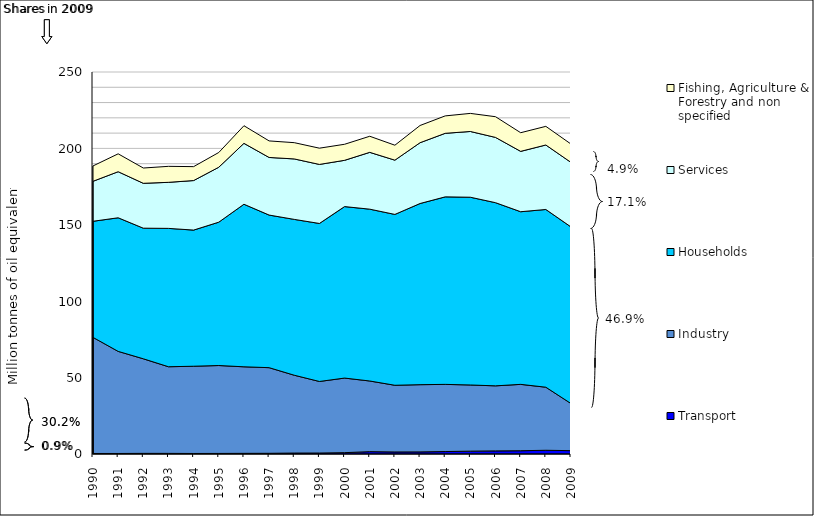
| Category | Transport | Industry | Households | Services | Fishing, Agriculture & Forestry and non specified |
|---|---|---|---|---|---|
| 1990.0 | 0.338 | 75.982 | 75.989 | 26.167 | 10.04 |
| 1991.0 | 0.339 | 66.817 | 87.44 | 30.148 | 11.707 |
| 1992.0 | 0.417 | 61.896 | 85.471 | 29.368 | 10.001 |
| 1993.0 | 0.399 | 56.709 | 90.549 | 30.137 | 10.464 |
| 1994.0 | 0.346 | 57.088 | 89.111 | 32.41 | 9.109 |
| 1995.0 | 0.374 | 57.528 | 93.828 | 35.948 | 9.653 |
| 1996.0 | 0.424 | 56.645 | 106.38 | 39.854 | 11.535 |
| 1997.0 | 0.457 | 56.041 | 99.877 | 37.699 | 10.823 |
| 1998.0 | 0.615 | 50.942 | 101.986 | 39.569 | 10.642 |
| 1999.0 | 0.638 | 46.823 | 103.418 | 38.628 | 10.634 |
| 2000.0 | 0.878 | 48.812 | 112.227 | 30.278 | 10.51 |
| 2001.0 | 1.544 | 46.239 | 112.453 | 37.176 | 10.539 |
| 2002.0 | 1.337 | 43.643 | 111.818 | 35.505 | 9.78 |
| 2003.0 | 1.372 | 43.999 | 118.564 | 39.793 | 11.262 |
| 2004.0 | 1.602 | 43.954 | 122.721 | 41.588 | 11.405 |
| 2005.0 | 1.867 | 43.305 | 122.871 | 43.036 | 11.826 |
| 2006.0 | 2.041 | 42.557 | 119.879 | 42.716 | 13.546 |
| 2007.0 | 2.146 | 43.423 | 112.987 | 39.503 | 12.205 |
| 2008.0 | 2.443 | 41.271 | 116.318 | 42.196 | 12.203 |
| 2009.0 | 2.19 | 30.832 | 115.57 | 42.238 | 12.004 |